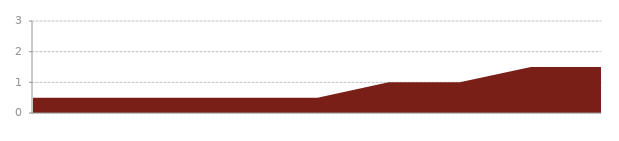
| Category | Series 0 |
|---|---|
| 0 | 0.5 |
| 1 | 0.5 |
| 2 | 0.5 |
| 3 | 0.5 |
| 4 | 0.5 |
| 5 | 1 |
| 6 | 1 |
| 7 | 1.5 |
| 8 | 1.5 |